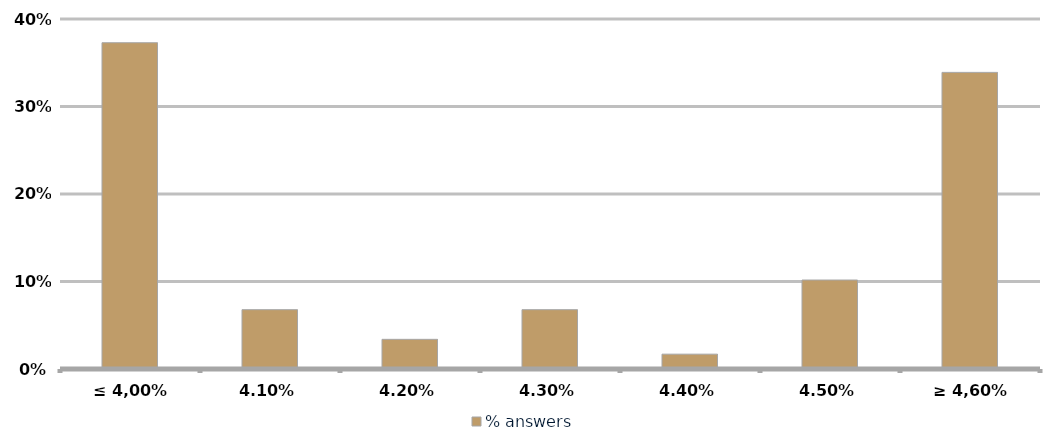
| Category | % answers |
|---|---|
| ≤ 4,00% | 0.373 |
| 4,10% | 0.068 |
| 4,20% | 0.034 |
| 4,30% | 0.068 |
| 4,40% | 0.017 |
| 4,50% | 0.102 |
| ≥ 4,60% | 0.339 |